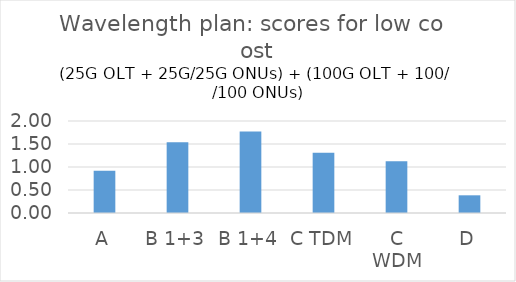
| Category | Series 0 |
|---|---|
| A | 0.916 |
| B 1+3 | 1.538 |
| B 1+4 | 1.769 |
| C TDM | 1.308 |
| C WDM | 1.126 |
| D | 0.385 |